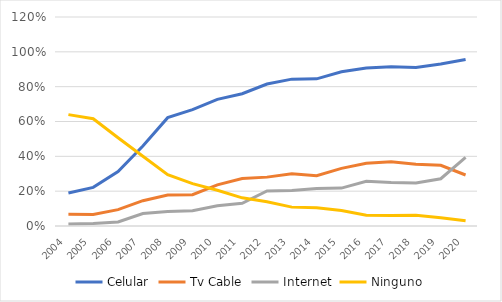
| Category | Celular | Tv Cable | Internet | Ninguno |
|---|---|---|---|---|
| 2004.0 | 0.189 | 0.067 | 0.011 | 0.639 |
| 2005.0 | 0.222 | 0.066 | 0.014 | 0.616 |
| 2006.0 | 0.312 | 0.094 | 0.023 | 0.507 |
| 2007.0 | 0.459 | 0.145 | 0.072 | 0.4 |
| 2008.0 | 0.622 | 0.178 | 0.083 | 0.294 |
| 2009.0 | 0.668 | 0.18 | 0.088 | 0.243 |
| 2010.0 | 0.727 | 0.236 | 0.116 | 0.205 |
| 2011.0 | 0.76 | 0.273 | 0.13 | 0.162 |
| 2012.0 | 0.815 | 0.281 | 0.201 | 0.139 |
| 2013.0 | 0.843 | 0.3 | 0.204 | 0.108 |
| 2014.0 | 0.845 | 0.289 | 0.216 | 0.105 |
| 2015.0 | 0.886 | 0.331 | 0.218 | 0.089 |
| 2016.0 | 0.908 | 0.36 | 0.257 | 0.062 |
| 2017.0 | 0.914 | 0.369 | 0.25 | 0.061 |
| 2018.0 | 0.91 | 0.354 | 0.247 | 0.061 |
| 2019.0 | 0.93 | 0.349 | 0.271 | 0.047 |
| 2020.0 | 0.956 | 0.293 | 0.394 | 0.03 |